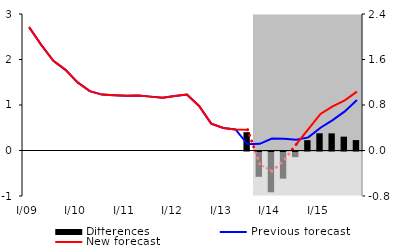
| Category | Differences |
|---|---|
| 0 | 0 |
| 1 | 0 |
| 2 | 0 |
| 3 | 0 |
| 4 | 0 |
| 5 | 0 |
| 6 | 0 |
| 7 | 0 |
| 8 | 0 |
| 9 | 0 |
| 10 | 0 |
| 11 | 0 |
| 12 | 0 |
| 13 | 0 |
| 14 | 0 |
| 15 | 0 |
| 16 | 0 |
| 17 | 0 |
| 18 | 0.322 |
| 19 | -0.445 |
| 20 | -0.717 |
| 21 | -0.477 |
| 22 | -0.1 |
| 23 | 0.181 |
| 24 | 0.302 |
| 25 | 0.301 |
| 26 | 0.244 |
| 27 | 0.183 |